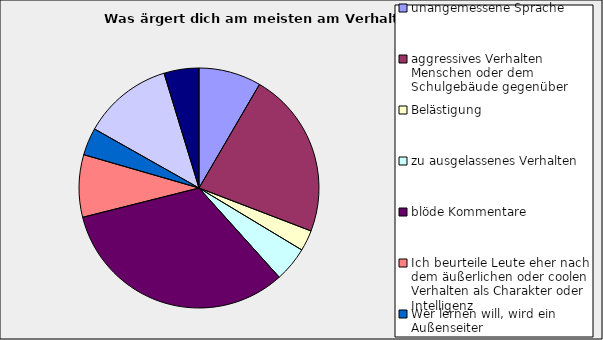
| Category | Series 0 |
|---|---|
| unangemessene Sprache | 0.084 |
| aggressives Verhalten Menschen oder dem Schulgebäude gegenüber | 0.224 |
| Belästigung | 0.028 |
| zu ausgelassenes Verhalten | 0.047 |
| blöde Kommentare | 0.327 |
| Ich beurteile Leute eher nach dem äußerlichen oder coolen Verhalten als Charakter oder Intelligenz | 0.084 |
| Wer lernen will, wird ein Außenseiter | 0.037 |
| Schmeichelhaftes Verhalten gegenüber Lehrern | 0.121 |
| ständiges Schummeln | 0.047 |